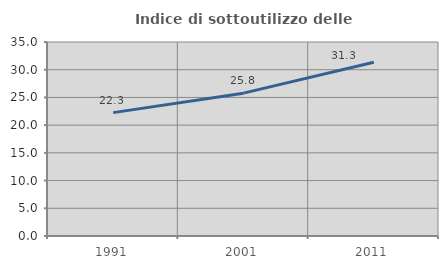
| Category | Indice di sottoutilizzo delle abitazioni  |
|---|---|
| 1991.0 | 22.256 |
| 2001.0 | 25.773 |
| 2011.0 | 31.347 |